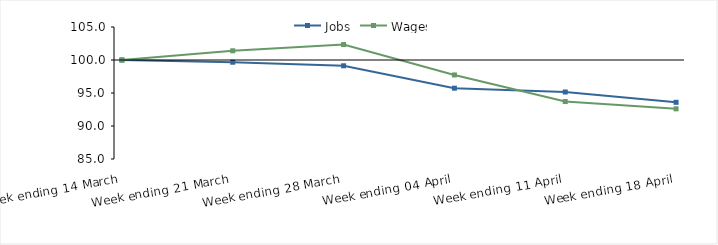
| Category | Jobs | Wages |
|---|---|---|
| 0 | 100 | 100 |
| 1900-01-01 | 99.663 | 101.396 |
| 1900-01-02 | 99.122 | 102.34 |
| 1900-01-03 | 95.731 | 97.739 |
| 1900-01-04 | 95.153 | 93.703 |
| 1900-01-05 | 93.59 | 92.602 |